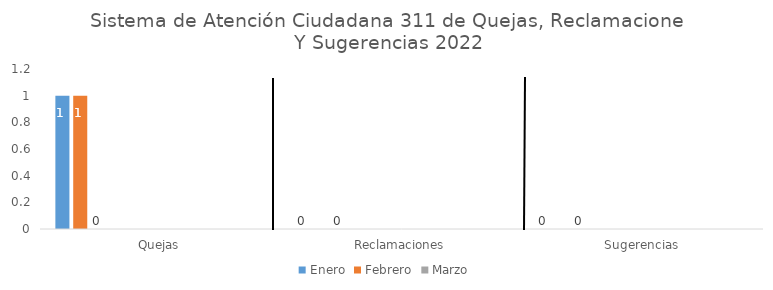
| Category | Enero | Febrero | Marzo | Abril | Mayo | Junio | Julio | Agosto | Septiembre | Octubre | Noviembre | Diciembre |
|---|---|---|---|---|---|---|---|---|---|---|---|---|
| Quejas | 1 | 1 | 0 | 0 | 0 | 0 | 0 | 0 | 0 | 0 | 0 | 0 |
| Reclamaciones | 0 | 0 | 0 | 0 | 0 | 0 | 0 | 0 | 0 | 0 | 0 | 0 |
| Sugerencias | 0 | 0 | 0 | 0 | 0 | 0 | 0 | 0 | 0 | 0 | 0 | 0 |